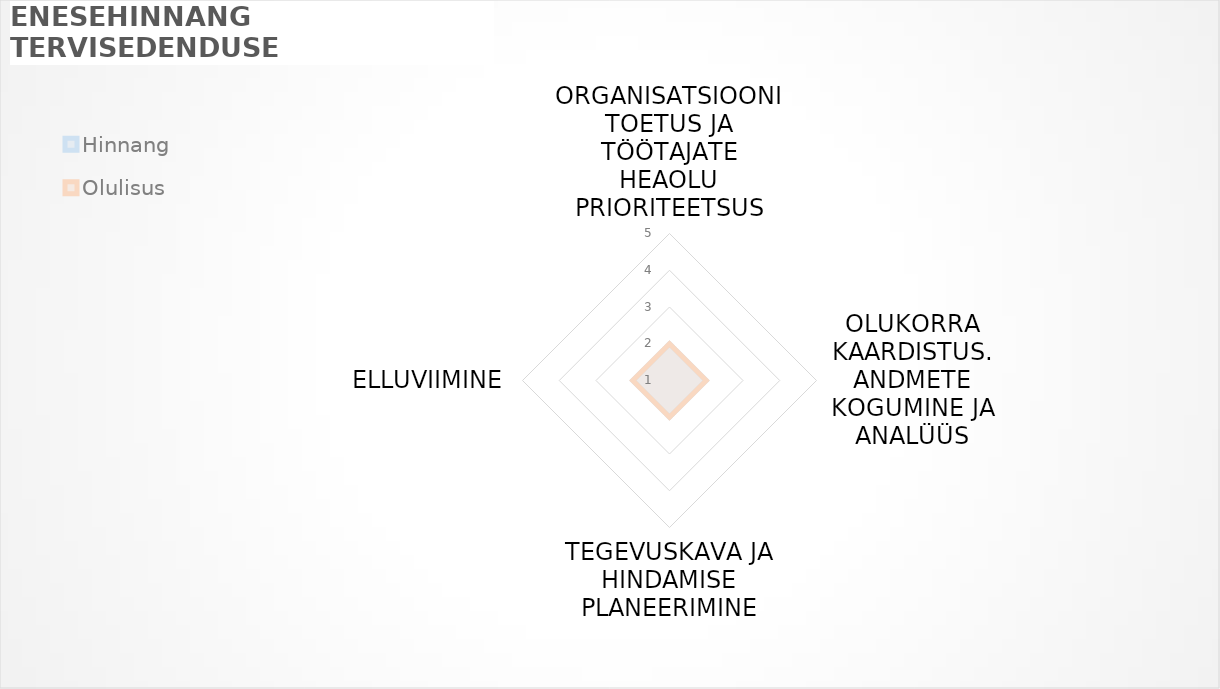
| Category | Hinnang | Olulisus |
|---|---|---|
| ORGANISATSIOONI TOETUS JA TÖÖTAJATE HEAOLU PRIORITEETSUS | 0 | 0 |
| OLUKORRA KAARDISTUS. ANDMETE KOGUMINE JA ANALÜÜS | 0 | 0 |
| TEGEVUSKAVA JA HINDAMISE PLANEERIMINE | 0 | 0 |
| ELLUVIIMINE | 0 | 0 |